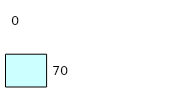
| Category | Series 0 | Series 1 |
|---|---|---|
| 0 | 70 | 0 |